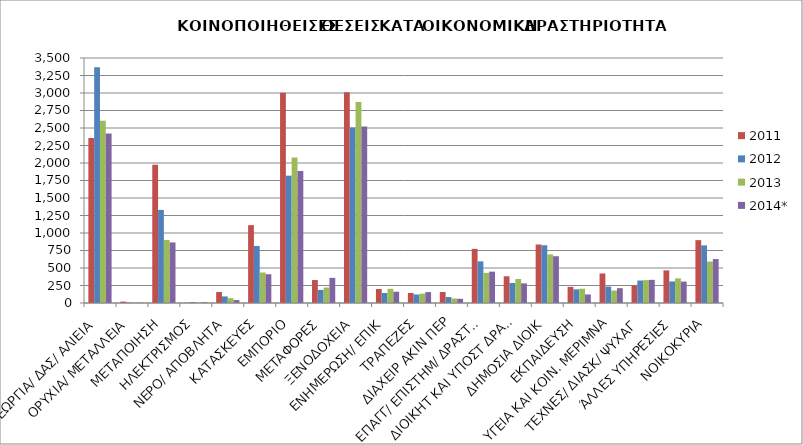
| Category | 2011 | 2012 | 2013 | 2014* |
|---|---|---|---|---|
| ΓΕΩΡΓΙΑ/ ΔΑΣ/ ΑΛΙΕΙΑ | 2358 | 3368 | 2605 | 2420 |
| ΟΡΥΧΙΑ/ ΜΕΤΑΛΛΕΙΑ | 20 | 7 | 2 | 4 |
| ΜΕΤΑΠΟΙΗΣΗ | 1976 | 1330 | 901 | 865 |
| ΗΛΕΚΤΡΙΣΜΟΣ | 3 | 13 | 5 | 10 |
| ΝΕΡΟ/ ΑΠΟΒΛΗΤΑ | 157 | 94 | 69 | 42 |
| ΚΑΤΑΣΚΕΥΕΣ | 1112 | 815 | 436 | 411 |
| ΕΜΠΟΡΙΟ | 3005 | 1819 | 2077 | 1885 |
| ΜΕΤΑΦΟΡΕΣ | 328 | 187 | 221 | 359 |
| ΞΕΝΟΔΟΧΕΙΑ | 3010 | 2507 | 2873 | 2520 |
| ΕΝΗΜΕΡΩΣΗ/ ΕΠΙΚ | 200 | 143 | 203 | 161 |
| ΤΡΑΠΕΖΕΣ | 143 | 121 | 134 | 156 |
| ΔΙΑΧΕΙΡ ΑΚΙΝ ΠΕΡ | 157 | 85 | 64 | 60 |
| ΕΠΑΓΓ/ ΕΠΙΣΤΗΜ/ ΔΡΑΣΤΗΡ | 774 | 595 | 430 | 448 |
| ΔΙΟΙΚΗΤ ΚΑΙ ΥΠΟΣΤ ΔΡΑΣΤΗΡ  | 382 | 285 | 343 | 280 |
| ΔΗΜΟΣΙΑ ΔΙΟΙΚ | 836 | 825 | 694 | 668 |
| ΕΚΠΑΙΔΕΥΣΗ | 230 | 195 | 204 | 122 |
| ΥΓΕΙΑ ΚΑΙ ΚΟΙΝ. ΜΕΡΙΜΝΑ | 422 | 235 | 178 | 212 |
| ΤΕΧΝΕΣ/ ΔΙΑΣΚ/ ΨΥΧΑΓ | 253 | 321 | 327 | 331 |
| ΆΛΛΕΣ ΥΠΗΡΕΣΙΕΣ | 466 | 308 | 352 | 306 |
| ΝΟΙΚΟΚΥΡΙΑ | 898 | 823 | 592 | 628 |